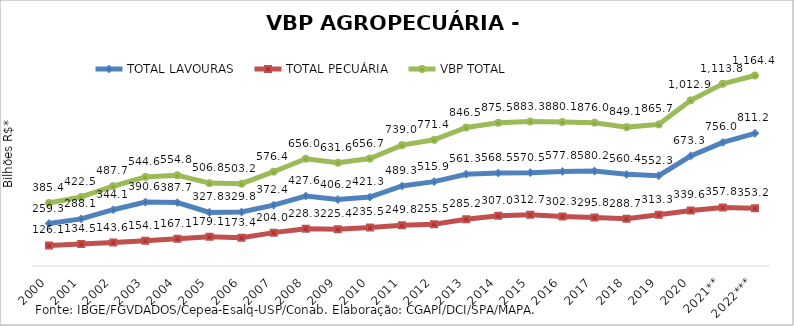
| Category | TOTAL LAVOURAS | TOTAL PECUÁRIA | VBP TOTAL |
|---|---|---|---|
| 2000 | 259.325 | 126.055 | 385.381 |
| 2001 | 288.063 | 134.485 | 422.548 |
| 2002 | 344.101 | 143.564 | 487.664 |
| 2003 | 390.552 | 154.091 | 544.643 |
| 2004 | 387.692 | 167.144 | 554.837 |
| 2005 | 327.776 | 179.052 | 506.829 |
| 2006 | 329.779 | 173.414 | 503.193 |
| 2007 | 372.425 | 204.012 | 576.437 |
| 2008 | 427.636 | 228.338 | 655.974 |
| 2009 | 406.197 | 225.368 | 631.566 |
| 2010 | 421.272 | 235.466 | 656.738 |
| 2011 | 489.255 | 249.77 | 739.024 |
| 2012 | 515.86 | 255.499 | 771.359 |
| 2013 | 561.259 | 285.234 | 846.493 |
| 2014 | 568.48 | 306.993 | 875.473 |
| 2015 | 570.543 | 312.742 | 883.285 |
| 2016 | 577.757 | 302.343 | 880.101 |
| 2017 | 580.156 | 295.847 | 876.003 |
| 2018 | 560.398 | 288.692 | 849.09 |
| 2019 | 552.339 | 313.314 | 865.653 |
| 2020 | 673.315 | 339.612 | 1012.927 |
| 2021** | 756.032 | 357.804 | 1113.836 |
| 2022*** | 811.233 | 353.162 | 1164.395 |